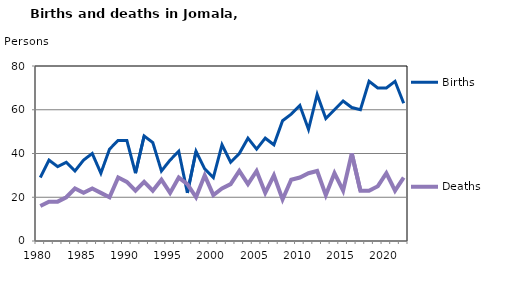
| Category | Births | Deaths |
|---|---|---|
| 1980.0 | 29 | 16 |
| 1981.0 | 37 | 18 |
| 1982.0 | 34 | 18 |
| 1983.0 | 36 | 20 |
| 1984.0 | 32 | 24 |
| 1985.0 | 37 | 22 |
| 1986.0 | 40 | 24 |
| 1987.0 | 31 | 22 |
| 1988.0 | 42 | 20 |
| 1989.0 | 46 | 29 |
| 1990.0 | 46 | 27 |
| 1991.0 | 31 | 23 |
| 1992.0 | 48 | 27 |
| 1993.0 | 45 | 23 |
| 1994.0 | 32 | 28 |
| 1995.0 | 37 | 22 |
| 1996.0 | 41 | 29 |
| 1997.0 | 22 | 26 |
| 1998.0 | 41 | 20 |
| 1999.0 | 33 | 30 |
| 2000.0 | 29 | 21 |
| 2001.0 | 44 | 24 |
| 2002.0 | 36 | 26 |
| 2003.0 | 40 | 32 |
| 2004.0 | 47 | 26 |
| 2005.0 | 42 | 32 |
| 2006.0 | 47 | 22 |
| 2007.0 | 44 | 30 |
| 2008.0 | 55 | 19 |
| 2009.0 | 58 | 28 |
| 2010.0 | 62 | 29 |
| 2011.0 | 51 | 31 |
| 2012.0 | 67 | 32 |
| 2013.0 | 56 | 21 |
| 2014.0 | 60 | 31 |
| 2015.0 | 64 | 23 |
| 2016.0 | 61 | 40 |
| 2017.0 | 60 | 23 |
| 2018.0 | 73 | 23 |
| 2019.0 | 70 | 25 |
| 2020.0 | 70 | 31 |
| 2021.0 | 73 | 23 |
| 2022.0 | 63 | 29 |